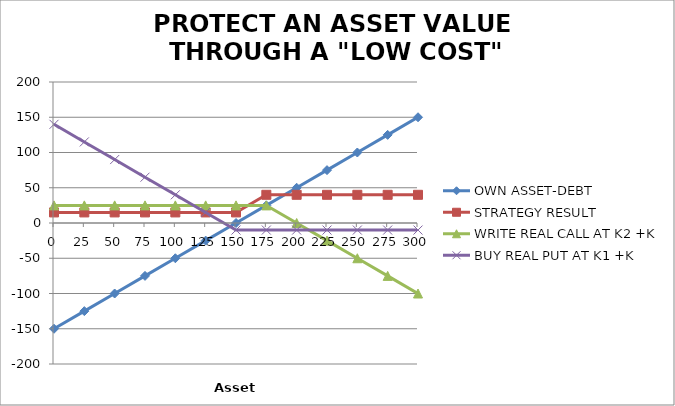
| Category | OWN ASSET-DEBT | STRATEGY RESULT | WRITE REAL CALL AT K2 +K | BUY REAL PUT AT K1 +K |
|---|---|---|---|---|
| 0.0 | -150 | 15 | 25 | 140 |
| 25.0 | -125 | 15 | 25 | 115 |
| 50.0 | -100 | 15 | 25 | 90 |
| 75.0 | -75 | 15 | 25 | 65 |
| 100.0 | -50 | 15 | 25 | 40 |
| 125.0 | -25 | 15 | 25 | 15 |
| 150.0 | 0 | 15 | 25 | -10 |
| 175.0 | 25 | 40 | 25 | -10 |
| 200.0 | 50 | 40 | 0 | -10 |
| 225.0 | 75 | 40 | -25 | -10 |
| 250.0 | 100 | 40 | -50 | -10 |
| 275.0 | 125 | 40 | -75 | -10 |
| 300.0 | 150 | 40 | -100 | -10 |